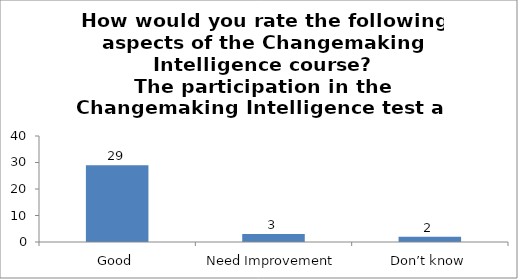
| Category | How would you rate the following aspects of the Changemaking Intelligence course?
The participation in the Changemaking Intelligence test as a team. |
|---|---|
| Good | 29 |
| Need Improvement | 3 |
| Don’t know | 2 |